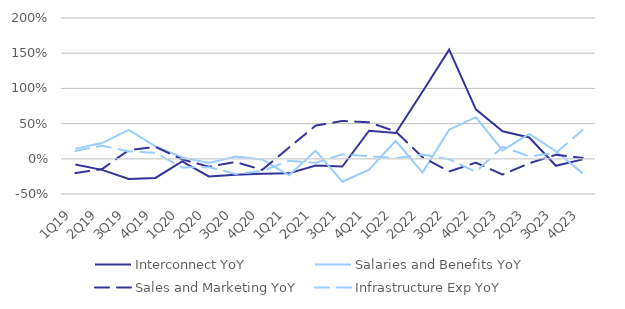
| Category | Interconnect YoY | Salaries and Benefits YoY | Sales and Marketing YoY | Infrastructure Exp YoY |
|---|---|---|---|---|
| 1Q19 | -0.082 | 0.144 | -0.202 | 0.111 |
| 2Q19 | -0.157 | 0.223 | -0.146 | 0.186 |
| 3Q19 | -0.287 | 0.41 | 0.123 | 0.106 |
| 4Q19 | -0.272 | 0.178 | 0.17 | 0.085 |
| 1Q20 | -0.036 | 0.02 | -0.009 | -0.123 |
| 2Q20 | -0.251 | -0.059 | -0.112 | -0.119 |
| 3Q20 | -0.226 | 0.034 | -0.045 | -0.215 |
| 4Q20 | -0.212 | -0.009 | -0.157 | -0.173 |
| 1Q21 | -0.207 | -0.234 | 0.159 | -0.028 |
| 2Q21 | -0.097 | 0.114 | 0.471 | -0.058 |
| 3Q21 | -0.11 | -0.326 | 0.538 | 0.063 |
| 4Q21 | 0.398 | -0.156 | 0.519 | 0.037 |
| 1Q22 | 0.366 | 0.256 | 0.388 | 0.009 |
| 2Q22 | 0.951 | -0.196 | 0.023 | 0.061 |
| 3Q22 | 1.55 | 0.413 | -0.18 | -0.006 |
| 4Q22 | 0.702 | 0.591 | -0.054 | -0.186 |
| 1Q23 | 0.392 | 0.12 | -0.224 | 0.173 |
| 2Q23 | 0.303 | 0.354 | -0.063 | 0.034 |
| 3Q23 | -0.099 | 0.107 | 0.057 | 0.084 |
| 4Q23 | -0.008 | -0.207 | 0.012 | 0.409 |